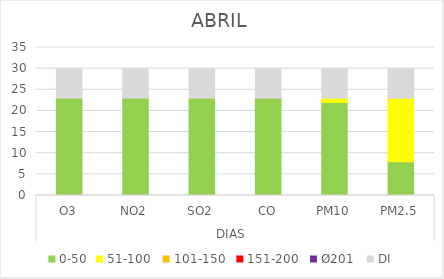
| Category | 0-50 | 51-100  | 101-150  | 151-200  | Ø201  | DI |
|---|---|---|---|---|---|---|
| 0 | 23 | 0 | 0 | 0 | 0 | 7 |
| 1 | 23 | 0 | 0 | 0 | 0 | 7 |
| 2 | 23 | 0 | 0 | 0 | 0 | 7 |
| 3 | 23 | 0 | 0 | 0 | 0 | 7 |
| 4 | 22 | 1 | 0 | 0 | 0 | 7 |
| 5 | 8 | 15 | 0 | 0 | 0 | 7 |